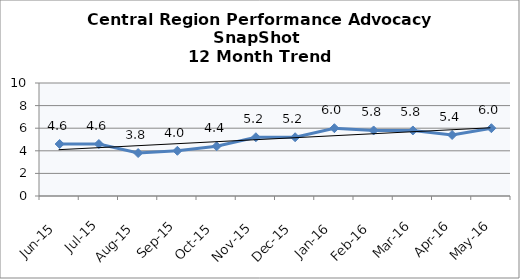
| Category | Central Region |
|---|---|
| Jun-15 | 4.6 |
| Jul-15 | 4.6 |
| Aug-15 | 3.8 |
| Sep-15 | 4 |
| Oct-15 | 4.4 |
| Nov-15 | 5.2 |
| Dec-15 | 5.2 |
| Jan-16 | 6 |
| Feb-16 | 5.8 |
| Mar-16 | 5.8 |
| Apr-16 | 5.4 |
| May-16 | 6 |